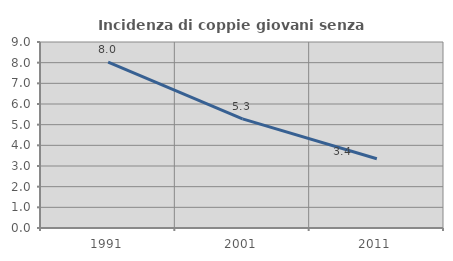
| Category | Incidenza di coppie giovani senza figli |
|---|---|
| 1991.0 | 8.029 |
| 2001.0 | 5.283 |
| 2011.0 | 3.35 |